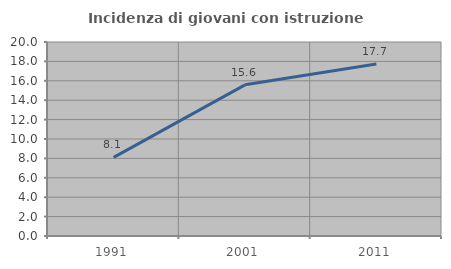
| Category | Incidenza di giovani con istruzione universitaria |
|---|---|
| 1991.0 | 8.108 |
| 2001.0 | 15.584 |
| 2011.0 | 17.722 |